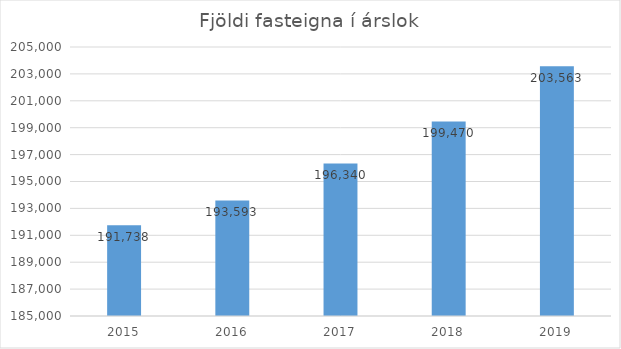
| Category | Fjöldi fasteigna í árslok |
|---|---|
| 2015.0 | 191738 |
| 2016.0 | 193593 |
| 2017.0 | 196340 |
| 2018.0 | 199470 |
| 2019.0 | 203563 |